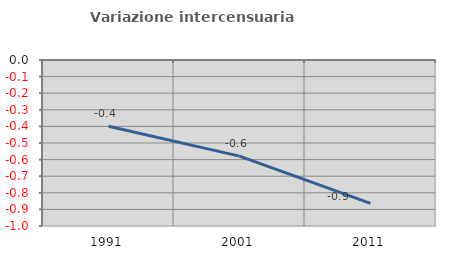
| Category | Variazione intercensuaria annua |
|---|---|
| 1991.0 | -0.399 |
| 2001.0 | -0.579 |
| 2011.0 | -0.863 |